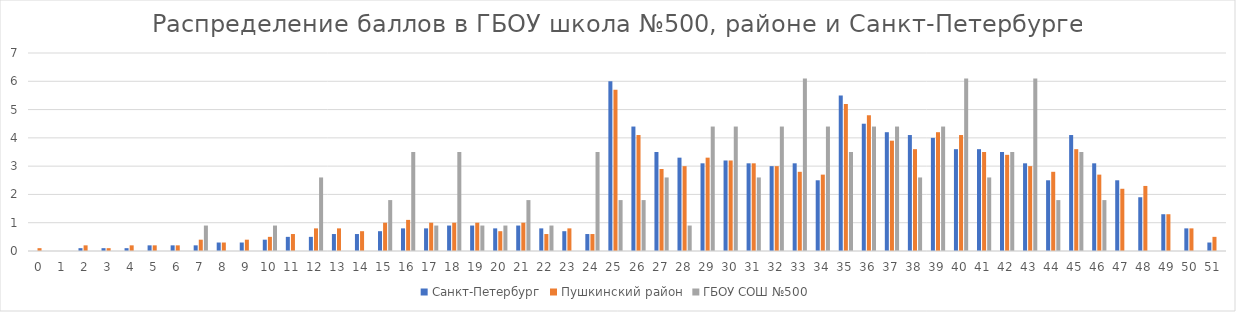
| Category | Санкт-Петербург | Пушкинский район | ГБОУ СОШ №500 |
|---|---|---|---|
| 0.0 | 0 | 0.1 | 0 |
| 1.0 | 0 | 0 | 0 |
| 2.0 | 0.1 | 0.2 | 0 |
| 3.0 | 0.1 | 0.1 | 0 |
| 4.0 | 0.1 | 0.2 | 0 |
| 5.0 | 0.2 | 0.2 | 0 |
| 6.0 | 0.2 | 0.2 | 0 |
| 7.0 | 0.2 | 0.4 | 0.9 |
| 8.0 | 0.3 | 0.3 | 0 |
| 9.0 | 0.3 | 0.4 | 0 |
| 10.0 | 0.4 | 0.5 | 0.9 |
| 11.0 | 0.5 | 0.6 | 0 |
| 12.0 | 0.5 | 0.8 | 2.6 |
| 13.0 | 0.6 | 0.8 | 0 |
| 14.0 | 0.6 | 0.7 | 0 |
| 15.0 | 0.7 | 1 | 1.8 |
| 16.0 | 0.8 | 1.1 | 3.5 |
| 17.0 | 0.8 | 1 | 0.9 |
| 18.0 | 0.9 | 1 | 3.5 |
| 19.0 | 0.9 | 1 | 0.9 |
| 20.0 | 0.8 | 0.7 | 0.9 |
| 21.0 | 0.9 | 1 | 1.8 |
| 22.0 | 0.8 | 0.6 | 0.9 |
| 23.0 | 0.7 | 0.8 | 0 |
| 24.0 | 0.6 | 0.6 | 3.5 |
| 25.0 | 6 | 5.7 | 1.8 |
| 26.0 | 4.4 | 4.1 | 1.8 |
| 27.0 | 3.5 | 2.9 | 2.6 |
| 28.0 | 3.3 | 3 | 0.9 |
| 29.0 | 3.1 | 3.3 | 4.4 |
| 30.0 | 3.2 | 3.2 | 4.4 |
| 31.0 | 3.1 | 3.1 | 2.6 |
| 32.0 | 3 | 3 | 4.4 |
| 33.0 | 3.1 | 2.8 | 6.1 |
| 34.0 | 2.5 | 2.7 | 4.4 |
| 35.0 | 5.5 | 5.2 | 3.5 |
| 36.0 | 4.5 | 4.8 | 4.4 |
| 37.0 | 4.2 | 3.9 | 4.4 |
| 38.0 | 4.1 | 3.6 | 2.6 |
| 39.0 | 4 | 4.2 | 4.4 |
| 40.0 | 3.6 | 4.1 | 6.1 |
| 41.0 | 3.6 | 3.5 | 2.6 |
| 42.0 | 3.5 | 3.4 | 3.5 |
| 43.0 | 3.1 | 3 | 6.1 |
| 44.0 | 2.5 | 2.8 | 1.8 |
| 45.0 | 4.1 | 3.6 | 3.5 |
| 46.0 | 3.1 | 2.7 | 1.8 |
| 47.0 | 2.5 | 2.2 | 0 |
| 48.0 | 1.9 | 2.3 | 0 |
| 49.0 | 1.3 | 1.3 | 0 |
| 50.0 | 0.8 | 0.8 | 0 |
| 51.0 | 0.3 | 0.5 | 0 |